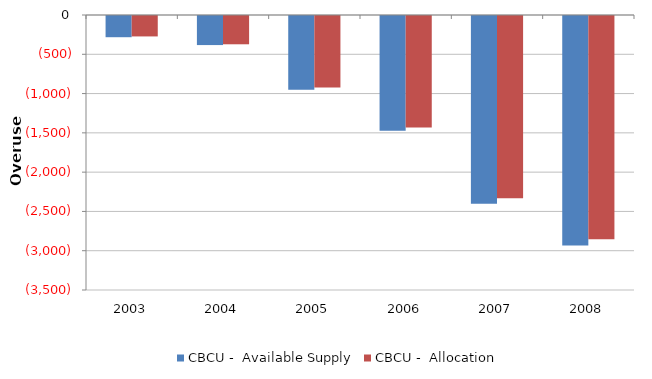
| Category | CBCU -  Available Supply | CBCU -  Allocation |
|---|---|---|
| 2003.0 | -270 | -260 |
| 2004.0 | -370 | -360 |
| 2005.0 | -940 | -910 |
| 2006.0 | -1460 | -1420 |
| 2007.0 | -2390 | -2320 |
| 2008.0 | -2920 | -2840 |